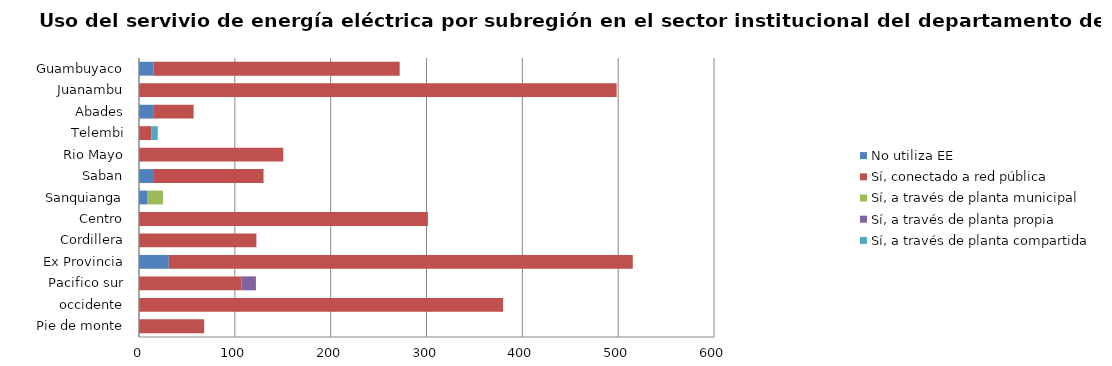
| Category | No utiliza EE | Sí, conectado a red pública | Sí, a través de planta municipal | Sí, a través de planta propia | Sí, a través de planta compartida |
|---|---|---|---|---|---|
| Pie de monte | 0 | 67.98 | 0 | 0 | 0 |
| occidente | 0 | 379.94 | 0 | 0 | 0 |
| Pacifico sur | 0 | 106.75 | 0 | 15.25 | 0 |
| Ex Provincia | 31.1 | 484.16 | 0 | 0 | 0 |
| Cordillera | 0 | 122.5 | 0 | 0 | 0 |
| Centro | 0 | 301.47 | 0 | 0 | 0 |
| Sanquianga | 8.33 | 0 | 16.66 | 0 | 0 |
| Saban | 15.62 | 114.34 | 0 | 0 | 0 |
| Rio Mayo | 0 | 150.54 | 0 | 0 | 0 |
| Telembi | 0 | 13.06 | 0 | 0 | 6.53 |
| Abades | 15.54 | 41.44 | 0 | 0 | 0 |
| Juanambu | 0 | 498.42 | 0 | 0 | 0 |
| Guambuyaco | 15.11 | 256.87 | 0 | 0 | 0 |